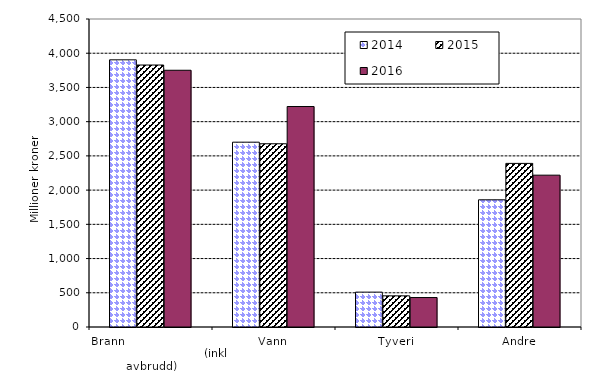
| Category | 2014 | 2015 | 2016 |
|---|---|---|---|
| Brann                                                       (inkl avbrudd) | 3903.557 | 3827.682 | 3751.149 |
| Vann | 2700.231 | 2677.196 | 3221.145 |
| Tyveri | 509.516 | 455.386 | 430.36 |
| Andre | 1858.527 | 2390.283 | 2218.392 |